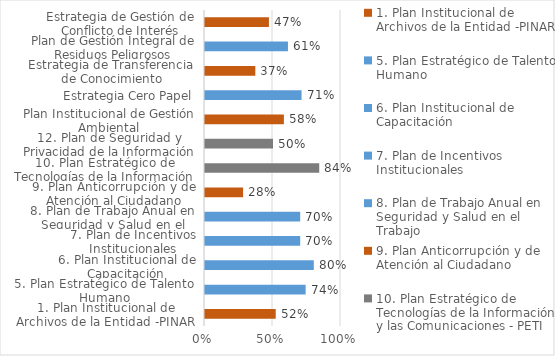
| Category | % avance  | % esperado |
|---|---|---|
| 1. Plan Institucional de Archivos de la Entidad ­PINAR | 0.52 |  |
| 5. Plan Estratégico de Talento Humano | 0.74 |  |
| 6. Plan Institucional de Capacitación | 0.8 |  |
| 7. Plan de Incentivos Institucionales | 0.7 |  |
| 8. Plan de Trabajo Anual en Seguridad y Salud en el Trabajo | 0.7 |  |
| 9. Plan Anticorrupción y de Atención al Ciudadano | 0.28 |  |
| 10. Plan Estratégico de Tecnologías de la Información y las Comunicaciones ­ PETI | 0.84 |  |
| 12. Plan de Seguridad y Privacidad de la Información | 0.5 |  |
| Plan Institucional de Gestión Ambiental | 0.58 |  |
| Estrategia Cero Papel | 0.71 |  |
| Estrategia de Transferencia de Conocimiento | 0.37 |  |
| Plan de Gestión Integral de Residuos Peligrosos | 0.61 |  |
| Estrategia de Gestión de Conflicto de Interés | 0.47 |  |